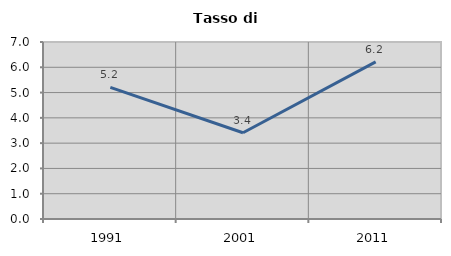
| Category | Tasso di disoccupazione   |
|---|---|
| 1991.0 | 5.207 |
| 2001.0 | 3.412 |
| 2011.0 | 6.212 |